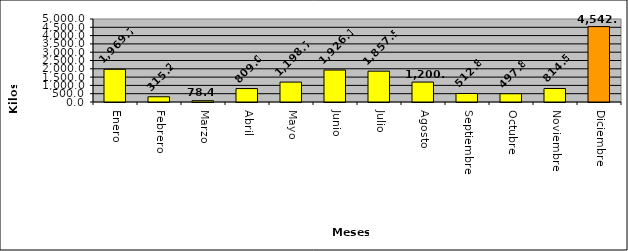
| Category | Cocaína |
|---|---|
| Enero | 1969.7 |
| Febrero | 315.2 |
| Marzo | 78.4 |
| Abril | 809 |
| Mayo | 1198.7 |
| Junio | 1926.1 |
| Julio | 1857.5 |
| Agosto | 1200.6 |
| Septiembre | 512.8 |
| Octubre | 497.8 |
| Noviembre | 814.5 |
| Diciembre | 4542.1 |